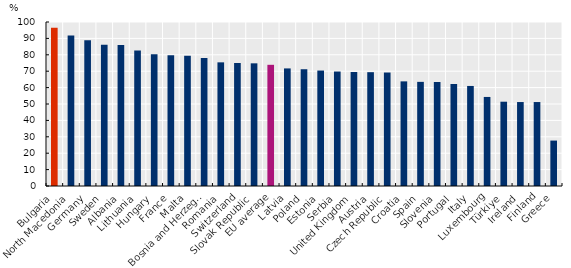
| Category | Series 0 |
|---|---|
| Bulgaria | 96.5 |
| North Macedonia | 91.7 |
| Germany  | 88.9 |
| Sweden | 86.2 |
| Albania | 85.9 |
| Lithuania | 82.6 |
| Hungary | 80.3 |
| France | 79.7 |
| Malta | 79.4 |
| Bosnia and Herzegovina | 78.1 |
| Romania | 75.4 |
| Switzerland | 75 |
| Slovak Republic | 74.8 |
| EU average | 73.9 |
| Latvia | 71.7 |
| Poland | 71.2 |
| Estonia | 70.4 |
| Serbia | 69.8 |
| United Kingdom | 69.5 |
| Austria | 69.4 |
| Czech Republic | 69.2 |
| Croatia | 63.8 |
| Spain | 63.5 |
| Slovenia | 63.4 |
| Portugal | 62.2 |
| Italy | 61 |
| Luxembourg | 54.3 |
| Türkiye | 51.4 |
| Ireland | 51.2 |
| Finland | 51.2 |
| Greece | 27.7 |